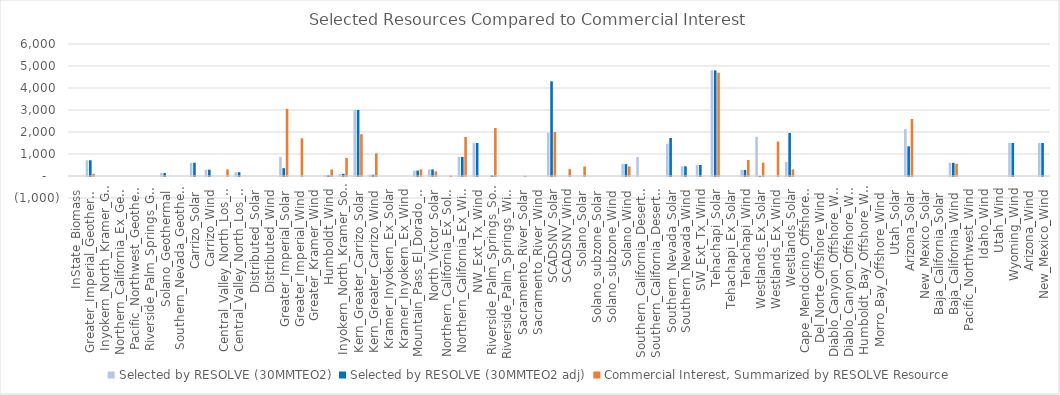
| Category | Selected by RESOLVE (30MMTEO2) | Selected by RESOLVE (30MMTEO2 adj) |  Commercial Interest, Summarized by RESOLVE Resource  |
|---|---|---|---|
| InState_Biomass | 0 | 0 | 0 |
| Greater_Imperial_Geothermal | 716.46 | 716.46 | 100 |
| Inyokern_North_Kramer_Geothermal | 0 | 0 | 0 |
| Northern_California_Ex_Geothermal | 0 | 0 | 0 |
| Pacific_Northwest_Geothermal | 0 | 0 | 0 |
| Riverside_Palm_Springs_Geothermal | 0 | 0 | 0 |
| Solano_Geothermal | 135 | 135 | 0 |
| Southern_Nevada_Geothermal | 0 | 0 | 0 |
| Carrizo_Solar | 600 | 600 | 0 |
| Carrizo_Wind | 287 | 287 | 0 |
| Central_Valley_North_Los_Banos_Solar | 0 | 0 | 298.35 |
| Central_Valley_North_Los_Banos_Wind | 173 | 173 | 0 |
| Distributed_Solar | 0 | 0 | 0 |
| Distributed_Wind | 0 | 0 | 0 |
| Greater_Imperial_Solar | 866.98 | 355.98 | 3050.58 |
| Greater_Imperial_Wind | 0 | 0 | 1715.3 |
| Greater_Kramer_Wind | 0 | 0 | 0 |
| Humboldt_Wind | 34 | 34 | 297.225 |
| Inyokern_North_Kramer_Solar | 97 | 97 | 824.26 |
| Kern_Greater_Carrizo_Solar | 3001.27 | 3001.27 | 1898.196 |
| Kern_Greater_Carrizo_Wind | 60 | 60 | 1030.2 |
| Kramer_Inyokern_Ex_Solar | 0 | 0 | 0 |
| Kramer_Inyokern_Ex_Wind | 0 | 0 | 0 |
| Mountain_Pass_El_Dorado_Solar | 248 | 248 | 300 |
| North_Victor_Solar | 300 | 300 | 210.88 |
| Northern_California_Ex_Solar | 0 | 0 | 20.6 |
| Northern_California_Ex_Wind | 865.9 | 865.9 | 1774 |
| NW_Ext_Tx_Wind | 1500 | 1500 | 0 |
| Riverside_Palm_Springs_Solar | 0 | 29 | 2182 |
| Riverside_Palm_Springs_Wind | 0 | 0 | 0 |
| Sacramento_River_Solar | 0 | 0 | 12 |
| Sacramento_River_Wind | 0 | 0 | 0 |
| SCADSNV_Solar | 1970 | 4303 | 2000.104 |
| SCADSNV_Wind | 0 | 0 | 310 |
| Solano_Solar | 0 | 0 | 431.4 |
| Solano_subzone_Solar | 0 | 0 | 0 |
| Solano_subzone_Wind | 0 | 0 | 0 |
| Solano_Wind | 542 | 542 | 433.704 |
| Southern_California_Desert_Ex_Solar | 862 | 0 | 0 |
| Southern_California_Desert_Ex_Wind | 0 | 0 | 0 |
| Southern_Nevada_Solar | 1470 | 1727 | 0 |
| Southern_Nevada_Wind | 442.03 | 442.03 | 0 |
| SW_Ext_Tx_Wind | 500 | 500 | 0 |
| Tehachapi_Solar | 4801 | 4801 | 4697.912 |
| Tehachapi_Ex_Solar | 0 | 0 | 0 |
| Tehachapi_Wind | 275 | 275 | 728.66 |
| Westlands_Ex_Solar | 1778.57 | -0.43 | 604.239 |
| Westlands_Ex_Wind | 0 | 0 | 1568 |
| Westlands_Solar | 633.68 | 1957.68 | 298.35 |
| Cape_Mendocino_Offshore_Wind | 0 | 0 | 0 |
| Del_Norte_Offshore_Wind | 0 | 0 | 0 |
| Diablo_Canyon_Offshore_Wind_Ext_Tx | 0 | 0 | 0 |
| Diablo_Canyon_Offshore_Wind | 0 | 0 | 0 |
| Humboldt_Bay_Offshore_Wind | 0 | 0 | 0 |
| Morro_Bay_Offshore_Wind | 0 | 0 | 0 |
| Utah_Solar | 0 | 0 | 0 |
| Arizona_Solar | 2140.97 | 1349.97 | 2595 |
| New_Mexico_Solar | 0 | 0 | 0 |
| Baja_California_Solar | 0 | 0 | 0 |
| Baja_California_Wind | 600 | 600 | 556 |
| Pacific_Northwest_Wind | 0 | 0 | 0 |
| Idaho_Wind | 0 | 0 | 0 |
| Utah_Wind | 0 | 0 | 0 |
| Wyoming_Wind | 1500 | 1500 | 0 |
| Arizona_Wind | 0 | 0 | 0 |
| New_Mexico_Wind | 1500 | 1500 | 0 |